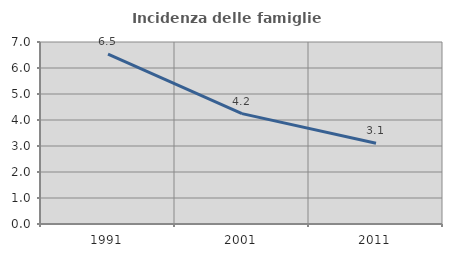
| Category | Incidenza delle famiglie numerose |
|---|---|
| 1991.0 | 6.537 |
| 2001.0 | 4.246 |
| 2011.0 | 3.109 |